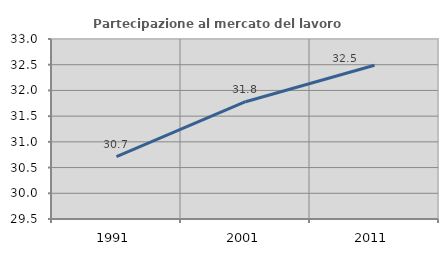
| Category | Partecipazione al mercato del lavoro  femminile |
|---|---|
| 1991.0 | 30.715 |
| 2001.0 | 31.78 |
| 2011.0 | 32.49 |